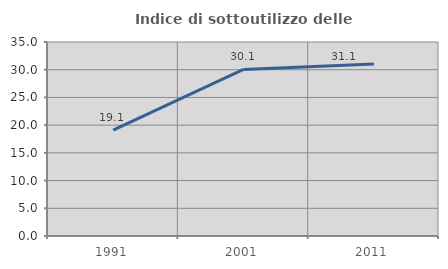
| Category | Indice di sottoutilizzo delle abitazioni  |
|---|---|
| 1991.0 | 19.084 |
| 2001.0 | 30.056 |
| 2011.0 | 31.05 |